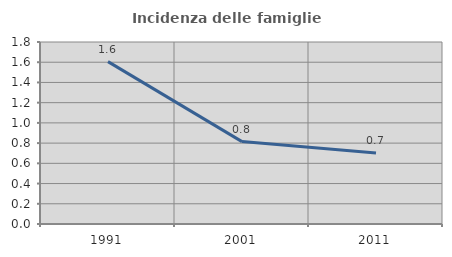
| Category | Incidenza delle famiglie numerose |
|---|---|
| 1991.0 | 1.606 |
| 2001.0 | 0.815 |
| 2011.0 | 0.701 |